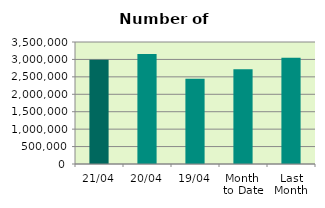
| Category | Series 0 |
|---|---|
| 21/04 | 2989624 |
| 20/04 | 3154988 |
| 19/04 | 2443552 |
| Month 
to Date | 2717470.308 |
| Last
Month | 3050763.217 |